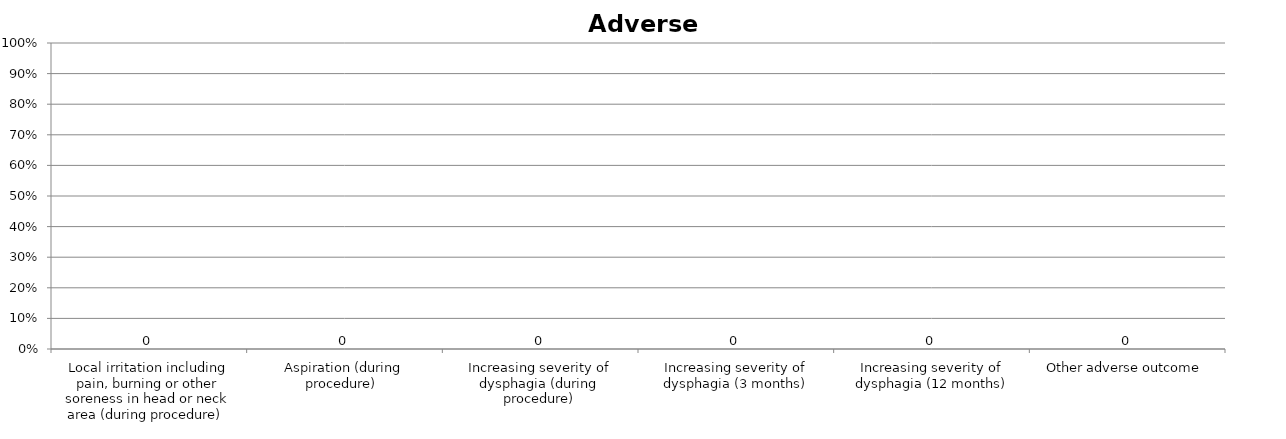
| Category | Series 0 |
|---|---|
| Local irritation including pain, burning or other soreness in head or neck area (during procedure)  | 0 |
| Aspiration (during procedure)  | 0 |
| Increasing severity of dysphagia (during procedure) | 0 |
| Increasing severity of dysphagia (3 months) | 0 |
| Increasing severity of dysphagia (12 months) | 0 |
| Other adverse outcome | 0 |